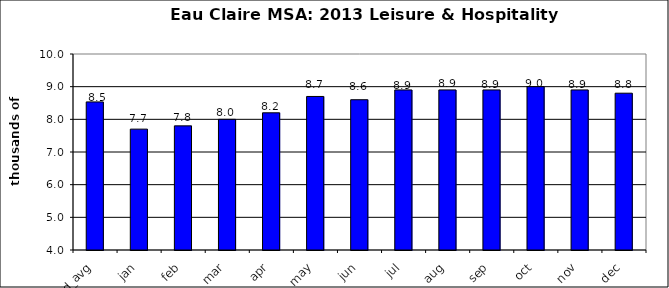
| Category | 2014 |
|---|---|
| ytd_avg | 8.533 |
| jan | 7.7 |
| feb | 7.8 |
| mar | 8 |
| apr | 8.2 |
| may | 8.7 |
| jun | 8.6 |
| jul | 8.9 |
| aug | 8.9 |
| sep | 8.9 |
| oct | 9 |
| nov | 8.9 |
| dec | 8.8 |